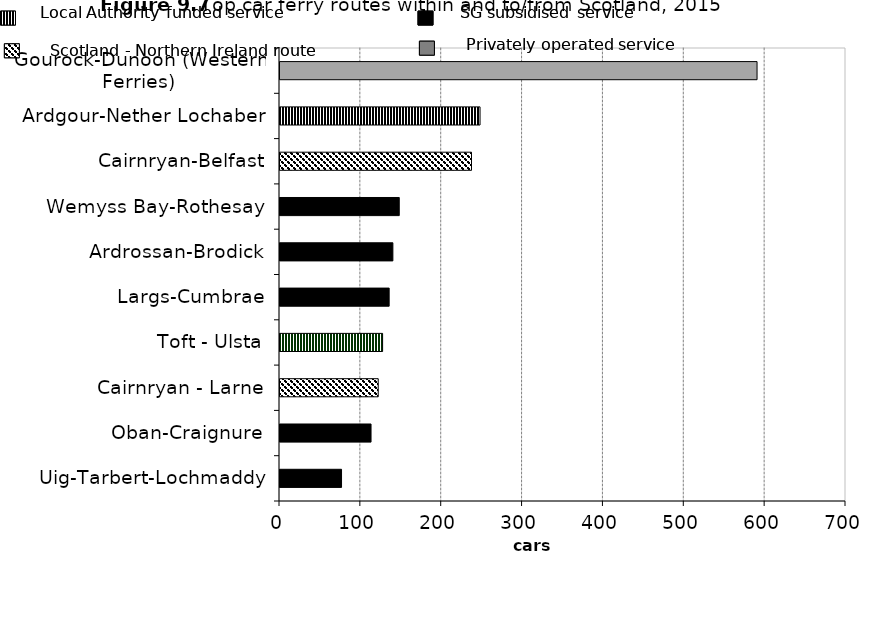
| Category | Cars |
|---|---|
| Uig-Tarbert-Lochmaddy | 76.1 |
| Oban-Craignure | 112.6 |
| Cairnryan - Larne | 121.471 |
| Toft - Ulsta | 126.9 |
| Largs-Cumbrae | 135 |
| Ardrossan-Brodick | 139.6 |
| Wemyss Bay-Rothesay | 147.5 |
| Cairnryan-Belfast | 236.844 |
| Ardgour-Nether Lochaber | 247.4 |
| Gourock-Dunoon (Western Ferries) | 590 |